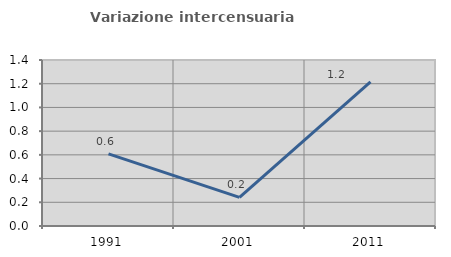
| Category | Variazione intercensuaria annua |
|---|---|
| 1991.0 | 0.608 |
| 2001.0 | 0.242 |
| 2011.0 | 1.216 |